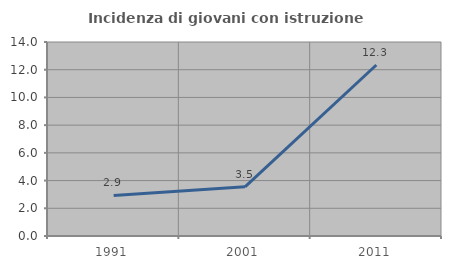
| Category | Incidenza di giovani con istruzione universitaria |
|---|---|
| 1991.0 | 2.927 |
| 2001.0 | 3.546 |
| 2011.0 | 12.34 |